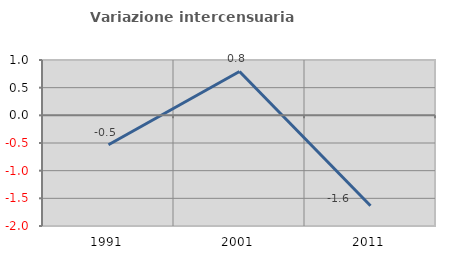
| Category | Variazione intercensuaria annua |
|---|---|
| 1991.0 | -0.532 |
| 2001.0 | 0.793 |
| 2011.0 | -1.634 |